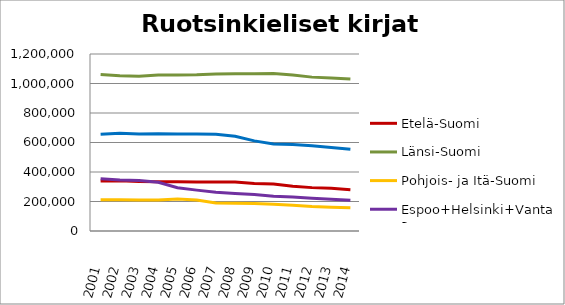
| Category | Etelä-Suomi | Länsi-Suomi | Pohjois- ja Itä-Suomi | Espoo+Helsinki+Vantaa | Muu Uusimaa |
|---|---|---|---|---|---|
| 2001.0 | 339474 | 1060845 | 211500 | 354570 | 655961 |
| 2002.0 | 340820 | 1052008 | 211868 | 346110 | 662072 |
| 2003.0 | 335124 | 1048947 | 209329 | 341952 | 657545 |
| 2004.0 | 334573 | 1057494 | 210701 | 330317 | 658840 |
| 2005.0 | 334226 | 1057970 | 216743 | 292826 | 656832 |
| 2006.0 | 332916 | 1059004 | 209530 | 277091 | 658067 |
| 2007.0 | 332911 | 1064630 | 190504 | 262842 | 656705 |
| 2008.0 | 332240 | 1065475 | 188007 | 253894 | 642871 |
| 2009.0 | 321782 | 1066301 | 186096 | 246973 | 610957 |
| 2010.0 | 319191 | 1068317 | 180944 | 235027 | 590499 |
| 2011.0 | 302951 | 1057832 | 174663 | 230175 | 586934 |
| 2012.0 | 294065 | 1043207 | 166088 | 221558 | 577928 |
| 2013.0 | 289014 | 1037873 | 161020 | 215370 | 566871 |
| 2014.0 | 279321 | 1030666 | 157340 | 207790 | 554870 |